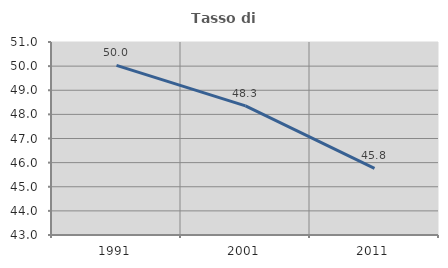
| Category | Tasso di occupazione   |
|---|---|
| 1991.0 | 50.032 |
| 2001.0 | 48.35 |
| 2011.0 | 45.762 |